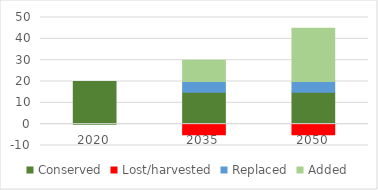
| Category | Conserved | Lost/harvested | Replaced | Added |
|---|---|---|---|---|
| 2020.0 | 20 | 0 | 0 | 0 |
| 2035.0 | 15 | -5 | 5 | 10 |
| 2050.0 | 15 | -5 | 5 | 25 |